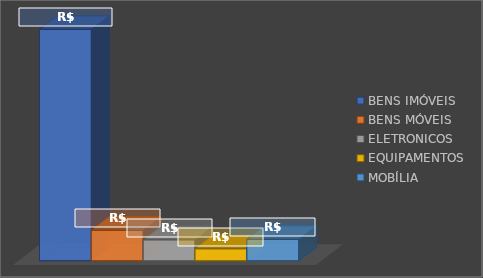
| Category | BENS IMÓVEIS | BENS MÓVEIS | ELETRONICOS | EQUIPAMENTOS | MOBÍLIA |
|---|---|---|---|---|---|
| 0 | 500000 | 65880 | 45180 | 25862 | 46199 |